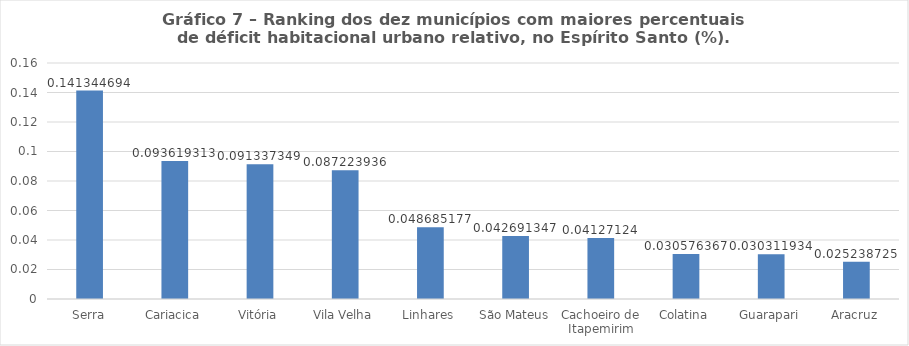
| Category | Series 0 |
|---|---|
| Serra | 0.141 |
| Cariacica | 0.094 |
| Vitória | 0.091 |
| Vila Velha | 0.087 |
| Linhares | 0.049 |
| São Mateus | 0.043 |
| Cachoeiro de Itapemirim | 0.041 |
| Colatina | 0.031 |
| Guarapari | 0.03 |
| Aracruz | 0.025 |